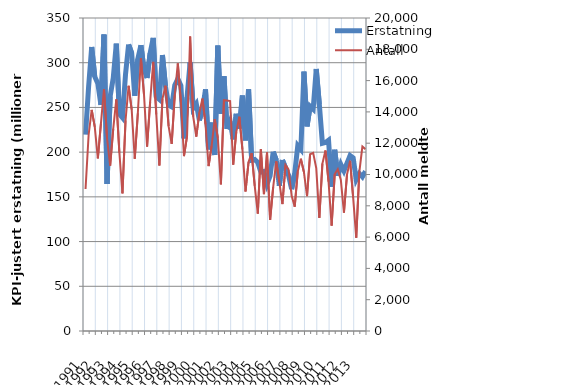
| Category | Erstatning |
|---|---|
| 1991.0 | 219.586 |
| nan | 273.204 |
| nan | 317.524 |
| nan | 284.387 |
| 1992.0 | 276.835 |
| nan | 252.95 |
| nan | 331.491 |
| nan | 164.406 |
| 1993.0 | 262.273 |
| nan | 282.589 |
| nan | 321.28 |
| nan | 242.592 |
| 1994.0 | 238.463 |
| nan | 287.132 |
| nan | 320.273 |
| nan | 310.718 |
| 1995.0 | 263.084 |
| nan | 304.339 |
| nan | 319.599 |
| nan | 292.658 |
| 1996.0 | 282.931 |
| nan | 310.593 |
| nan | 327.701 |
| nan | 261.99 |
| 1997.0 | 259.021 |
| nan | 308.509 |
| nan | 273.07 |
| nan | 252.443 |
| 1998.0 | 250.561 |
| nan | 274.861 |
| nan | 281.847 |
| nan | 274.264 |
| 1999.0 | 215.461 |
| nan | 261.441 |
| nan | 300.465 |
| nan | 249.21 |
| 2000.0 | 254.031 |
| nan | 235.584 |
| nan | 247.117 |
| nan | 270.159 |
| 2001.0 | 203.157 |
| nan | 233.013 |
| nan | 196.769 |
| nan | 319.142 |
| 2002.0 | 242.984 |
| nan | 284.87 |
| nan | 225.911 |
| nan | 234.548 |
| 2003.0 | 214.298 |
| nan | 242.827 |
| nan | 226.425 |
| nan | 263.275 |
| 2004.0 | 213.218 |
| nan | 270.293 |
| nan | 190.968 |
| nan | 191.765 |
| 2005.0 | 188.494 |
| nan | 177.652 |
| nan | 178.389 |
| nan | 164.279 |
| 2006.0 | 173.332 |
| nan | 200.446 |
| nan | 191.175 |
| nan | 162.506 |
| 2007.0 | 191.192 |
| nan | 182.639 |
| nan | 174.187 |
| nan | 158.64 |
| 2008.0 | 176.254 |
| nan | 207.24 |
| nan | 203.099 |
| nan | 290.139 |
| 2009.0 | 228.892 |
| nan | 251.211 |
| nan | 248.067 |
| nan | 292.993 |
| 2010.0 | 253.489 |
| nan | 209.889 |
| nan | 210.751 |
| nan | 213.264 |
| 2011.0 | 161.308 |
| nan | 202.632 |
| nan | 173.506 |
| nan | 186.238 |
| 2012.0 | 179.074 |
| nan | 187.704 |
| nan | 196.168 |
| nan | 193.591 |
| 2013.0 | 169.362 |
| nan | 176.036 |
| nan | 172.418 |
| nan | 178.636 |